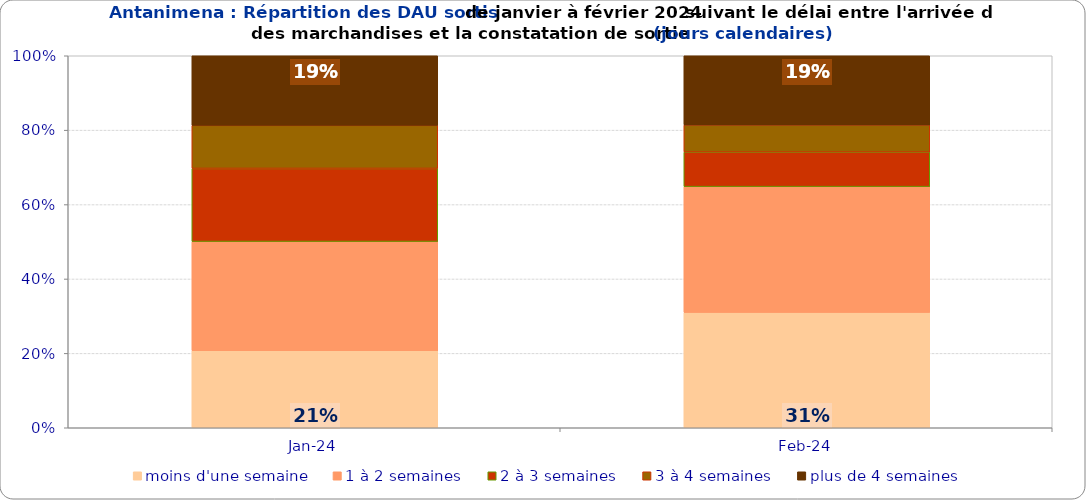
| Category | moins d'une semaine | 1 à 2 semaines | 2 à 3 semaines | 3 à 4 semaines | plus de 4 semaines |
|---|---|---|---|---|---|
| 2024-01-01 | 0.207 | 0.294 | 0.196 | 0.116 | 0.187 |
| 2024-02-01 | 0.31 | 0.338 | 0.093 | 0.073 | 0.186 |